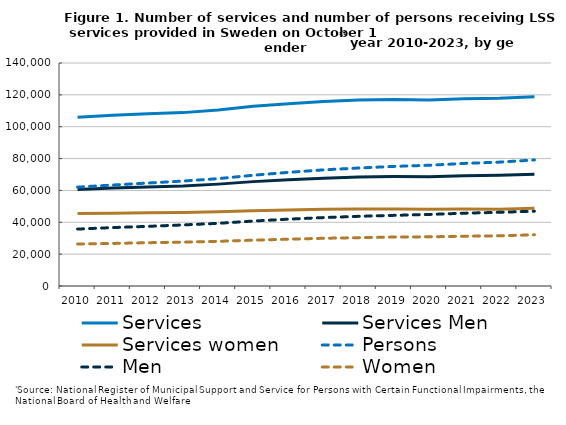
| Category | Services | Services Men | Services women | Persons | Men | Women |
|---|---|---|---|---|---|---|
| 2010.0 | 106010 | 60516 | 45494 | 62077 | 35733 | 26344 |
| 2011.0 | 107176 | 61480 | 45696 | 63387 | 36675 | 26712 |
| 2012.0 | 108190 | 62186 | 46004 | 64635 | 37447 | 27188 |
| 2013.0 | 108846 | 62780 | 46066 | 65884 | 38334 | 27550 |
| 2014.0 | 110513 | 63958 | 46555 | 67397 | 39342 | 28055 |
| 2015.0 | 112817 | 65526 | 47291 | 69540 | 40773 | 28767 |
| 2016.0 | 114466 | 66678 | 47788 | 71349 | 41965 | 29384 |
| 2017.0 | 115860 | 67668 | 48192 | 72910 | 42945 | 29965 |
| 2018.0 | 116718 | 68356 | 48362 | 74085 | 43744 | 30341 |
| 2019.0 | 117087 | 68670 | 48417 | 75083 | 44348 | 30735 |
| 2020.0 | 116827 | 68652 | 48175 | 75800 | 44918 | 30882 |
| 2021.0 | 117553 | 69263 | 48290 | 76966 | 45713 | 31253 |
| 2022.0 | 117828 | 69585 | 48243 | 77764 | 46255 | 31509 |
| 2023.0 | 118846 | 70103 | 48743 | 79125 | 46965 | 32160 |